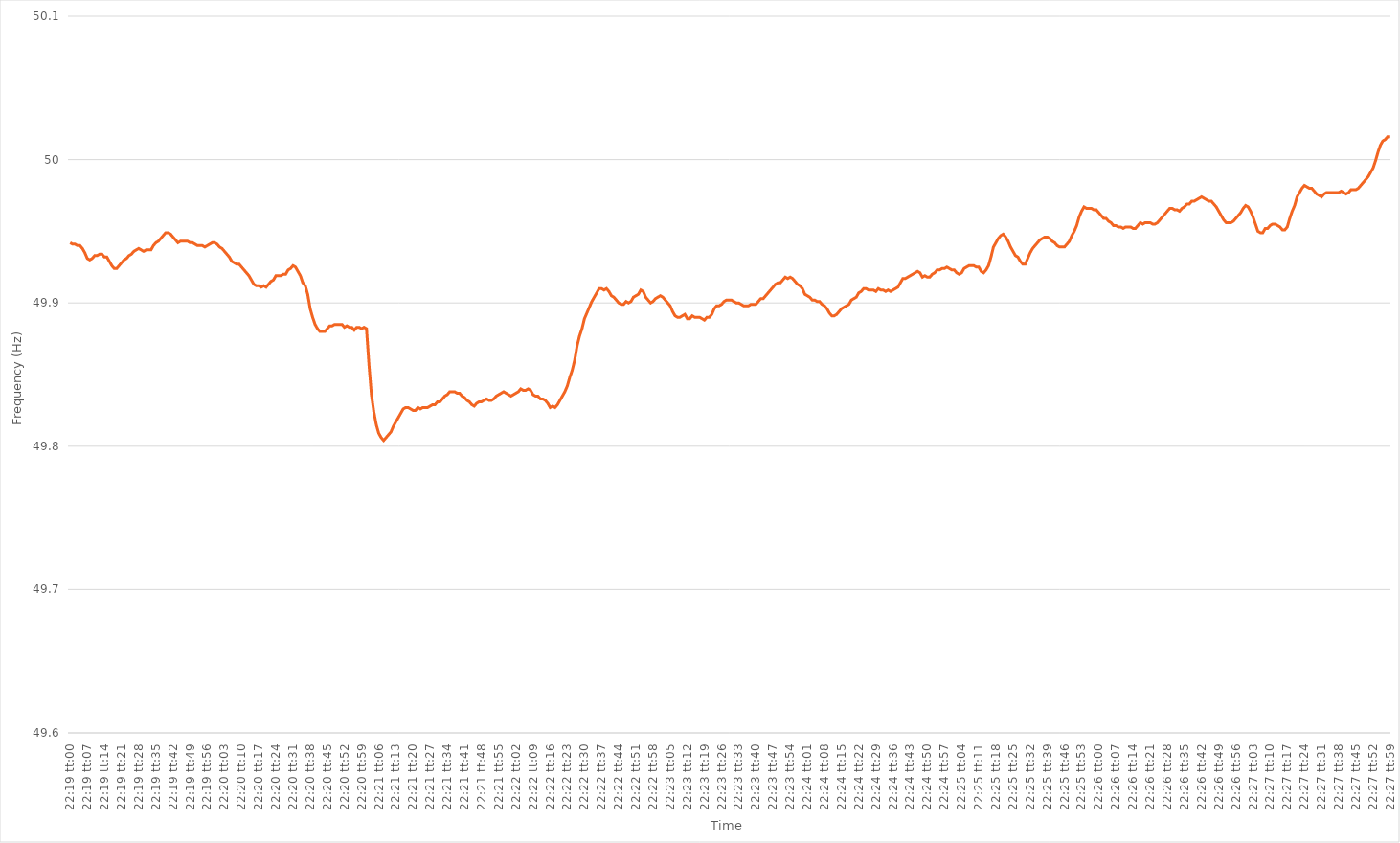
| Category | Series 0 |
|---|---|
| 0.9298611111111111 | 49.942 |
| 0.9298726851851852 | 49.941 |
| 0.9298842592592593 | 49.941 |
| 0.9298958333333333 | 49.94 |
| 0.9299074074074074 | 49.94 |
| 0.9299189814814816 | 49.938 |
| 0.9299305555555556 | 49.935 |
| 0.9299421296296296 | 49.931 |
| 0.9299537037037037 | 49.93 |
| 0.9299652777777778 | 49.931 |
| 0.9299768518518517 | 49.933 |
| 0.9299884259259259 | 49.933 |
| 0.93 | 49.934 |
| 0.9300115740740741 | 49.934 |
| 0.9300231481481481 | 49.932 |
| 0.9300347222222222 | 49.932 |
| 0.9300462962962963 | 49.929 |
| 0.9300578703703705 | 49.926 |
| 0.9300694444444444 | 49.924 |
| 0.9300810185185185 | 49.924 |
| 0.9300925925925926 | 49.926 |
| 0.9301041666666667 | 49.928 |
| 0.9301157407407407 | 49.93 |
| 0.9301273148148148 | 49.931 |
| 0.930138888888889 | 49.933 |
| 0.930150462962963 | 49.934 |
| 0.930162037037037 | 49.936 |
| 0.9301736111111111 | 49.937 |
| 0.9301851851851852 | 49.938 |
| 0.9301967592592592 | 49.937 |
| 0.9302083333333333 | 49.936 |
| 0.9302199074074075 | 49.937 |
| 0.9302314814814815 | 49.937 |
| 0.9302430555555555 | 49.937 |
| 0.9302546296296296 | 49.94 |
| 0.9302662037037037 | 49.942 |
| 0.9302777777777779 | 49.943 |
| 0.9302893518518518 | 49.945 |
| 0.930300925925926 | 49.947 |
| 0.9303125 | 49.949 |
| 0.9303240740740741 | 49.949 |
| 0.9303356481481481 | 49.948 |
| 0.9303472222222222 | 49.946 |
| 0.9303587962962964 | 49.944 |
| 0.9303703703703704 | 49.942 |
| 0.9303819444444444 | 49.943 |
| 0.9303935185185185 | 49.943 |
| 0.9304050925925926 | 49.943 |
| 0.9304166666666666 | 49.943 |
| 0.9304282407407407 | 49.942 |
| 0.9304398148148149 | 49.942 |
| 0.9304513888888889 | 49.941 |
| 0.9304629629629629 | 49.94 |
| 0.930474537037037 | 49.94 |
| 0.9304861111111111 | 49.94 |
| 0.9304976851851853 | 49.939 |
| 0.9305092592592592 | 49.94 |
| 0.9305208333333334 | 49.941 |
| 0.9305324074074074 | 49.942 |
| 0.9305439814814815 | 49.942 |
| 0.9305555555555555 | 49.941 |
| 0.9305671296296296 | 49.939 |
| 0.9305787037037038 | 49.938 |
| 0.9305902777777778 | 49.936 |
| 0.9306018518518518 | 49.934 |
| 0.9306134259259259 | 49.932 |
| 0.930625 | 49.929 |
| 0.930636574074074 | 49.928 |
| 0.9306481481481481 | 49.927 |
| 0.9306597222222223 | 49.927 |
| 0.9306712962962963 | 49.925 |
| 0.9306828703703703 | 49.923 |
| 0.9306944444444444 | 49.921 |
| 0.9307060185185185 | 49.919 |
| 0.9307175925925927 | 49.916 |
| 0.9307291666666666 | 49.913 |
| 0.9307407407407408 | 49.912 |
| 0.9307523148148148 | 49.912 |
| 0.930763888888889 | 49.911 |
| 0.9307754629629629 | 49.912 |
| 0.930787037037037 | 49.911 |
| 0.9307986111111112 | 49.913 |
| 0.9308101851851852 | 49.915 |
| 0.9308217592592593 | 49.916 |
| 0.9308333333333333 | 49.919 |
| 0.9308449074074074 | 49.919 |
| 0.9308564814814816 | 49.919 |
| 0.9308680555555555 | 49.92 |
| 0.9308796296296297 | 49.92 |
| 0.9308912037037037 | 49.923 |
| 0.9309027777777777 | 49.924 |
| 0.9309143518518518 | 49.926 |
| 0.9309259259259259 | 49.925 |
| 0.9309375000000001 | 49.922 |
| 0.930949074074074 | 49.919 |
| 0.9309606481481482 | 49.914 |
| 0.9309722222222222 | 49.912 |
| 0.9309837962962964 | 49.906 |
| 0.9309953703703703 | 49.896 |
| 0.9310069444444444 | 49.89 |
| 0.9310185185185186 | 49.885 |
| 0.9310300925925926 | 49.882 |
| 0.9310416666666667 | 49.88 |
| 0.9310532407407407 | 49.88 |
| 0.9310648148148148 | 49.88 |
| 0.931076388888889 | 49.882 |
| 0.9310879629629629 | 49.884 |
| 0.9310995370370371 | 49.884 |
| 0.9311111111111111 | 49.885 |
| 0.9311226851851852 | 49.885 |
| 0.9311342592592592 | 49.885 |
| 0.9311458333333333 | 49.885 |
| 0.9311574074074075 | 49.883 |
| 0.9311689814814814 | 49.884 |
| 0.9311805555555556 | 49.883 |
| 0.9311921296296296 | 49.883 |
| 0.9312037037037038 | 49.881 |
| 0.9312152777777777 | 49.883 |
| 0.9312268518518518 | 49.883 |
| 0.931238425925926 | 49.882 |
| 0.93125 | 49.883 |
| 0.9312615740740741 | 49.882 |
| 0.9312731481481481 | 49.857 |
| 0.9312847222222222 | 49.836 |
| 0.9312962962962964 | 49.824 |
| 0.9313078703703703 | 49.815 |
| 0.9313194444444445 | 49.809 |
| 0.9313310185185185 | 49.806 |
| 0.9313425925925927 | 49.804 |
| 0.9313541666666666 | 49.806 |
| 0.9313657407407407 | 49.808 |
| 0.9313773148148149 | 49.81 |
| 0.9313888888888888 | 49.814 |
| 0.931400462962963 | 49.817 |
| 0.931412037037037 | 49.82 |
| 0.9314236111111112 | 49.823 |
| 0.9314351851851851 | 49.826 |
| 0.9314467592592592 | 49.827 |
| 0.9314583333333334 | 49.827 |
| 0.9314699074074074 | 49.826 |
| 0.9314814814814815 | 49.825 |
| 0.9314930555555555 | 49.825 |
| 0.9315046296296297 | 49.827 |
| 0.9315162037037038 | 49.826 |
| 0.9315277777777777 | 49.827 |
| 0.9315393518518519 | 49.827 |
| 0.9315509259259259 | 49.827 |
| 0.9315625000000001 | 49.828 |
| 0.931574074074074 | 49.829 |
| 0.9315856481481481 | 49.829 |
| 0.9315972222222223 | 49.831 |
| 0.9316087962962962 | 49.831 |
| 0.9316203703703704 | 49.833 |
| 0.9316319444444444 | 49.835 |
| 0.9316435185185186 | 49.836 |
| 0.9316550925925925 | 49.838 |
| 0.9316666666666666 | 49.838 |
| 0.9316782407407408 | 49.838 |
| 0.9316898148148148 | 49.837 |
| 0.9317013888888889 | 49.837 |
| 0.9317129629629629 | 49.835 |
| 0.9317245370370371 | 49.834 |
| 0.9317361111111112 | 49.832 |
| 0.9317476851851851 | 49.831 |
| 0.9317592592592593 | 49.829 |
| 0.9317708333333333 | 49.828 |
| 0.9317824074074075 | 49.83 |
| 0.9317939814814814 | 49.831 |
| 0.9318055555555556 | 49.831 |
| 0.9318171296296297 | 49.832 |
| 0.9318287037037036 | 49.833 |
| 0.9318402777777778 | 49.832 |
| 0.9318518518518518 | 49.832 |
| 0.931863425925926 | 49.833 |
| 0.9318749999999999 | 49.835 |
| 0.931886574074074 | 49.836 |
| 0.9318981481481482 | 49.837 |
| 0.9319097222222222 | 49.838 |
| 0.9319212962962963 | 49.837 |
| 0.9319328703703703 | 49.836 |
| 0.9319444444444445 | 49.835 |
| 0.9319560185185186 | 49.836 |
| 0.9319675925925925 | 49.837 |
| 0.9319791666666667 | 49.838 |
| 0.9319907407407407 | 49.84 |
| 0.9320023148148149 | 49.839 |
| 0.9320138888888888 | 49.839 |
| 0.932025462962963 | 49.84 |
| 0.9320370370370371 | 49.839 |
| 0.932048611111111 | 49.836 |
| 0.9320601851851852 | 49.835 |
| 0.9320717592592592 | 49.835 |
| 0.9320833333333334 | 49.833 |
| 0.9320949074074073 | 49.833 |
| 0.9321064814814815 | 49.832 |
| 0.9321180555555556 | 49.83 |
| 0.9321296296296296 | 49.827 |
| 0.9321412037037037 | 49.828 |
| 0.9321527777777777 | 49.827 |
| 0.9321643518518519 | 49.829 |
| 0.932175925925926 | 49.832 |
| 0.9321875 | 49.835 |
| 0.9321990740740741 | 49.838 |
| 0.9322106481481481 | 49.842 |
| 0.9322222222222223 | 49.848 |
| 0.9322337962962962 | 49.853 |
| 0.9322453703703704 | 49.86 |
| 0.9322569444444445 | 49.87 |
| 0.9322685185185186 | 49.877 |
| 0.9322800925925926 | 49.882 |
| 0.9322916666666666 | 49.889 |
| 0.9323032407407408 | 49.893 |
| 0.9323148148148147 | 49.897 |
| 0.9323263888888889 | 49.901 |
| 0.932337962962963 | 49.904 |
| 0.932349537037037 | 49.907 |
| 0.9323611111111111 | 49.91 |
| 0.9323726851851851 | 49.91 |
| 0.9323842592592593 | 49.909 |
| 0.9323958333333334 | 49.91 |
| 0.9324074074074074 | 49.908 |
| 0.9324189814814815 | 49.905 |
| 0.9324305555555555 | 49.904 |
| 0.9324421296296297 | 49.902 |
| 0.9324537037037036 | 49.9 |
| 0.9324652777777778 | 49.899 |
| 0.9324768518518519 | 49.899 |
| 0.932488425925926 | 49.901 |
| 0.9325 | 49.9 |
| 0.932511574074074 | 49.901 |
| 0.9325231481481482 | 49.904 |
| 0.9325347222222223 | 49.905 |
| 0.9325462962962963 | 49.906 |
| 0.9325578703703704 | 49.909 |
| 0.9325694444444445 | 49.908 |
| 0.9325810185185185 | 49.904 |
| 0.9325925925925925 | 49.902 |
| 0.9326041666666667 | 49.9 |
| 0.9326157407407408 | 49.901 |
| 0.9326273148148148 | 49.903 |
| 0.9326388888888889 | 49.904 |
| 0.932650462962963 | 49.905 |
| 0.9326620370370371 | 49.904 |
| 0.932673611111111 | 49.902 |
| 0.9326851851851852 | 49.9 |
| 0.9326967592592593 | 49.898 |
| 0.9327083333333334 | 49.894 |
| 0.9327199074074074 | 49.891 |
| 0.9327314814814814 | 49.89 |
| 0.9327430555555556 | 49.89 |
| 0.9327546296296297 | 49.891 |
| 0.9327662037037037 | 49.892 |
| 0.9327777777777778 | 49.889 |
| 0.9327893518518519 | 49.889 |
| 0.9328009259259259 | 49.891 |
| 0.9328124999999999 | 49.89 |
| 0.9328240740740741 | 49.89 |
| 0.9328356481481482 | 49.89 |
| 0.9328472222222222 | 49.889 |
| 0.9328587962962963 | 49.888 |
| 0.9328703703703703 | 49.89 |
| 0.9328819444444445 | 49.89 |
| 0.9328935185185184 | 49.892 |
| 0.9329050925925926 | 49.896 |
| 0.9329166666666667 | 49.898 |
| 0.9329282407407408 | 49.898 |
| 0.9329398148148148 | 49.899 |
| 0.9329513888888888 | 49.901 |
| 0.932962962962963 | 49.902 |
| 0.9329745370370371 | 49.902 |
| 0.9329861111111111 | 49.902 |
| 0.9329976851851852 | 49.901 |
| 0.9330092592592593 | 49.9 |
| 0.9330208333333333 | 49.9 |
| 0.9330324074074073 | 49.899 |
| 0.9330439814814815 | 49.898 |
| 0.9330555555555556 | 49.898 |
| 0.9330671296296296 | 49.898 |
| 0.9330787037037037 | 49.899 |
| 0.9330902777777778 | 49.899 |
| 0.9331018518518519 | 49.899 |
| 0.9331134259259258 | 49.901 |
| 0.933125 | 49.903 |
| 0.9331365740740741 | 49.903 |
| 0.9331481481481482 | 49.905 |
| 0.9331597222222222 | 49.907 |
| 0.9331712962962962 | 49.909 |
| 0.9331828703703704 | 49.911 |
| 0.9331944444444445 | 49.913 |
| 0.9332060185185185 | 49.914 |
| 0.9332175925925926 | 49.914 |
| 0.9332291666666667 | 49.916 |
| 0.9332407407407407 | 49.918 |
| 0.9332523148148147 | 49.917 |
| 0.9332638888888889 | 49.918 |
| 0.933275462962963 | 49.917 |
| 0.933287037037037 | 49.915 |
| 0.9332986111111111 | 49.913 |
| 0.9333101851851852 | 49.912 |
| 0.9333217592592593 | 49.91 |
| 0.9333333333333332 | 49.906 |
| 0.9333449074074074 | 49.905 |
| 0.9333564814814815 | 49.904 |
| 0.9333680555555556 | 49.902 |
| 0.9333796296296296 | 49.902 |
| 0.9333912037037037 | 49.901 |
| 0.9334027777777778 | 49.901 |
| 0.933414351851852 | 49.899 |
| 0.9334259259259259 | 49.898 |
| 0.9334375 | 49.896 |
| 0.9334490740740741 | 49.893 |
| 0.9334606481481482 | 49.891 |
| 0.9334722222222221 | 49.891 |
| 0.9334837962962963 | 49.892 |
| 0.9334953703703704 | 49.894 |
| 0.9335069444444444 | 49.896 |
| 0.9335185185185185 | 49.897 |
| 0.9335300925925926 | 49.898 |
| 0.9335416666666667 | 49.899 |
| 0.9335532407407406 | 49.902 |
| 0.9335648148148148 | 49.903 |
| 0.9335763888888889 | 49.904 |
| 0.933587962962963 | 49.907 |
| 0.933599537037037 | 49.908 |
| 0.9336111111111111 | 49.91 |
| 0.9336226851851852 | 49.91 |
| 0.9336342592592594 | 49.909 |
| 0.9336458333333333 | 49.909 |
| 0.9336574074074074 | 49.909 |
| 0.9336689814814815 | 49.908 |
| 0.9336805555555556 | 49.91 |
| 0.9336921296296296 | 49.909 |
| 0.9337037037037037 | 49.909 |
| 0.9337152777777779 | 49.908 |
| 0.9337268518518518 | 49.909 |
| 0.9337384259259259 | 49.908 |
| 0.93375 | 49.909 |
| 0.9337615740740741 | 49.91 |
| 0.933773148148148 | 49.911 |
| 0.9337847222222222 | 49.914 |
| 0.9337962962962963 | 49.917 |
| 0.9338078703703704 | 49.917 |
| 0.9338194444444444 | 49.918 |
| 0.9338310185185185 | 49.919 |
| 0.9338425925925926 | 49.92 |
| 0.9338541666666668 | 49.921 |
| 0.9338657407407407 | 49.922 |
| 0.9338773148148148 | 49.921 |
| 0.9338888888888889 | 49.918 |
| 0.933900462962963 | 49.919 |
| 0.933912037037037 | 49.918 |
| 0.9339236111111111 | 49.918 |
| 0.9339351851851853 | 49.92 |
| 0.9339467592592593 | 49.921 |
| 0.9339583333333333 | 49.923 |
| 0.9339699074074074 | 49.923 |
| 0.9339814814814815 | 49.924 |
| 0.9339930555555555 | 49.924 |
| 0.9340046296296296 | 49.925 |
| 0.9340162037037038 | 49.924 |
| 0.9340277777777778 | 49.923 |
| 0.9340393518518518 | 49.923 |
| 0.9340509259259259 | 49.921 |
| 0.9340625 | 49.92 |
| 0.9340740740740742 | 49.921 |
| 0.9340856481481481 | 49.924 |
| 0.9340972222222222 | 49.925 |
| 0.9341087962962963 | 49.926 |
| 0.9341203703703704 | 49.926 |
| 0.9341319444444444 | 49.926 |
| 0.9341435185185185 | 49.925 |
| 0.9341550925925927 | 49.925 |
| 0.9341666666666667 | 49.922 |
| 0.9341782407407407 | 49.921 |
| 0.9341898148148148 | 49.923 |
| 0.9342013888888889 | 49.926 |
| 0.9342129629629629 | 49.932 |
| 0.934224537037037 | 49.939 |
| 0.9342361111111112 | 49.942 |
| 0.9342476851851852 | 49.945 |
| 0.9342592592592592 | 49.947 |
| 0.9342708333333333 | 49.948 |
| 0.9342824074074074 | 49.946 |
| 0.9342939814814816 | 49.943 |
| 0.9343055555555555 | 49.939 |
| 0.9343171296296297 | 49.936 |
| 0.9343287037037037 | 49.933 |
| 0.9343402777777778 | 49.932 |
| 0.9343518518518518 | 49.929 |
| 0.9343634259259259 | 49.927 |
| 0.9343750000000001 | 49.927 |
| 0.9343865740740741 | 49.931 |
| 0.9343981481481481 | 49.935 |
| 0.9344097222222222 | 49.938 |
| 0.9344212962962963 | 49.94 |
| 0.9344328703703703 | 49.942 |
| 0.9344444444444444 | 49.944 |
| 0.9344560185185186 | 49.945 |
| 0.9344675925925926 | 49.946 |
| 0.9344791666666666 | 49.946 |
| 0.9344907407407407 | 49.945 |
| 0.9345023148148148 | 49.943 |
| 0.934513888888889 | 49.942 |
| 0.9345254629629629 | 49.94 |
| 0.934537037037037 | 49.939 |
| 0.9345486111111111 | 49.939 |
| 0.9345601851851852 | 49.939 |
| 0.9345717592592592 | 49.941 |
| 0.9345833333333333 | 49.943 |
| 0.9345949074074075 | 49.947 |
| 0.9346064814814815 | 49.95 |
| 0.9346180555555555 | 49.954 |
| 0.9346296296296296 | 49.96 |
| 0.9346412037037037 | 49.964 |
| 0.9346527777777777 | 49.967 |
| 0.9346643518518518 | 49.966 |
| 0.934675925925926 | 49.966 |
| 0.9346875 | 49.966 |
| 0.934699074074074 | 49.965 |
| 0.9347106481481481 | 49.965 |
| 0.9347222222222222 | 49.963 |
| 0.9347337962962964 | 49.961 |
| 0.9347453703703703 | 49.959 |
| 0.9347569444444445 | 49.959 |
| 0.9347685185185185 | 49.957 |
| 0.9347800925925926 | 49.956 |
| 0.9347916666666666 | 49.954 |
| 0.9348032407407407 | 49.954 |
| 0.9348148148148149 | 49.953 |
| 0.9348263888888889 | 49.953 |
| 0.934837962962963 | 49.952 |
| 0.934849537037037 | 49.953 |
| 0.9348611111111111 | 49.953 |
| 0.9348726851851853 | 49.953 |
| 0.9348842592592592 | 49.952 |
| 0.9348958333333334 | 49.952 |
| 0.9349074074074074 | 49.954 |
| 0.9349189814814814 | 49.956 |
| 0.9349305555555555 | 49.955 |
| 0.9349421296296296 | 49.956 |
| 0.9349537037037038 | 49.956 |
| 0.9349652777777777 | 49.956 |
| 0.9349768518518519 | 49.955 |
| 0.9349884259259259 | 49.955 |
| 0.935 | 49.956 |
| 0.935011574074074 | 49.958 |
| 0.9350231481481481 | 49.96 |
| 0.9350347222222223 | 49.962 |
| 0.9350462962962963 | 49.964 |
| 0.9350578703703704 | 49.966 |
| 0.9350694444444444 | 49.966 |
| 0.9350810185185185 | 49.965 |
| 0.9350925925925927 | 49.965 |
| 0.9351041666666666 | 49.964 |
| 0.9351157407407408 | 49.966 |
| 0.9351273148148148 | 49.967 |
| 0.935138888888889 | 49.969 |
| 0.9351504629629629 | 49.969 |
| 0.935162037037037 | 49.971 |
| 0.9351736111111112 | 49.971 |
| 0.9351851851851851 | 49.972 |
| 0.9351967592592593 | 49.973 |
| 0.9352083333333333 | 49.974 |
| 0.9352199074074075 | 49.973 |
| 0.9352314814814814 | 49.972 |
| 0.9352430555555555 | 49.971 |
| 0.9352546296296297 | 49.971 |
| 0.9352662037037037 | 49.969 |
| 0.9352777777777778 | 49.967 |
| 0.9352893518518518 | 49.964 |
| 0.935300925925926 | 49.961 |
| 0.9353125000000001 | 49.958 |
| 0.935324074074074 | 49.956 |
| 0.9353356481481482 | 49.956 |
| 0.9353472222222222 | 49.956 |
| 0.9353587962962964 | 49.957 |
| 0.9353703703703703 | 49.959 |
| 0.9353819444444444 | 49.961 |
| 0.9353935185185186 | 49.963 |
| 0.9354050925925925 | 49.966 |
| 0.9354166666666667 | 49.968 |
| 0.9354282407407407 | 49.967 |
| 0.9354398148148149 | 49.964 |
| 0.9354513888888888 | 49.96 |
| 0.9354629629629629 | 49.955 |
| 0.9354745370370371 | 49.95 |
| 0.9354861111111111 | 49.949 |
| 0.9354976851851852 | 49.949 |
| 0.9355092592592592 | 49.952 |
| 0.9355208333333334 | 49.952 |
| 0.9355324074074075 | 49.954 |
| 0.9355439814814814 | 49.955 |
| 0.9355555555555556 | 49.955 |
| 0.9355671296296296 | 49.954 |
| 0.9355787037037038 | 49.953 |
| 0.9355902777777777 | 49.951 |
| 0.9356018518518519 | 49.951 |
| 0.935613425925926 | 49.953 |
| 0.9356249999999999 | 49.959 |
| 0.9356365740740741 | 49.964 |
| 0.9356481481481481 | 49.968 |
| 0.9356597222222223 | 49.974 |
| 0.9356712962962962 | 49.977 |
| 0.9356828703703703 | 49.98 |
| 0.9356944444444445 | 49.982 |
| 0.9357060185185185 | 49.981 |
| 0.9357175925925926 | 49.98 |
| 0.9357291666666666 | 49.98 |
| 0.9357407407407408 | 49.978 |
| 0.9357523148148149 | 49.976 |
| 0.9357638888888888 | 49.975 |
| 0.935775462962963 | 49.974 |
| 0.935787037037037 | 49.976 |
| 0.9357986111111112 | 49.977 |
| 0.9358101851851851 | 49.977 |
| 0.9358217592592593 | 49.977 |
| 0.9358333333333334 | 49.977 |
| 0.9358449074074073 | 49.977 |
| 0.9358564814814815 | 49.977 |
| 0.9358680555555555 | 49.978 |
| 0.9358796296296297 | 49.977 |
| 0.9358912037037036 | 49.976 |
| 0.9359027777777778 | 49.977 |
| 0.9359143518518519 | 49.979 |
| 0.9359259259259259 | 49.979 |
| 0.9359375 | 49.979 |
| 0.935949074074074 | 49.98 |
| 0.9359606481481482 | 49.982 |
| 0.9359722222222223 | 49.984 |
| 0.9359837962962962 | 49.986 |
| 0.9359953703703704 | 49.988 |
| 0.9360069444444444 | 49.991 |
| 0.9360185185185186 | 49.994 |
| 0.9360300925925925 | 49.999 |
| 0.9360416666666667 | 50.005 |
| 0.9360532407407408 | 50.01 |
| 0.9360648148148148 | 50.013 |
| 0.9360763888888889 | 50.014 |
| 0.9360879629629629 | 50.016 |
| 0.9360995370370371 | 50.016 |